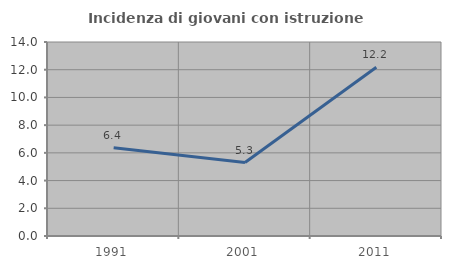
| Category | Incidenza di giovani con istruzione universitaria |
|---|---|
| 1991.0 | 6.367 |
| 2001.0 | 5.298 |
| 2011.0 | 12.183 |